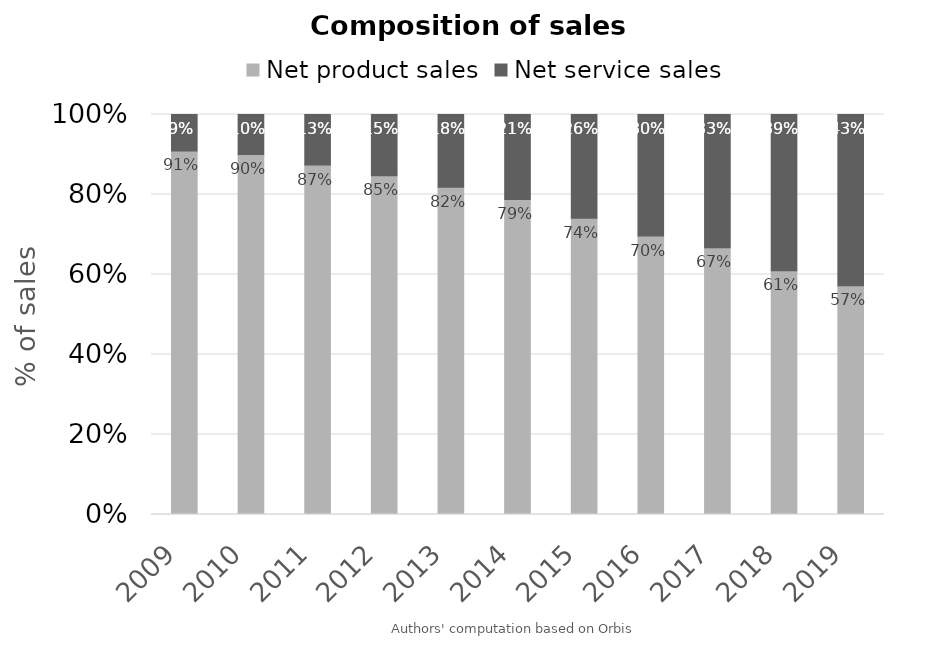
| Category | Net product sales | Net service sales |
|---|---|---|
| 2009.0 | 0.909 | 0.091 |
| 2010.0 | 0.9 | 0.1 |
| 2011.0 | 0.874 | 0.126 |
| 2012.0 | 0.847 | 0.153 |
| 2013.0 | 0.818 | 0.182 |
| 2014.0 | 0.788 | 0.212 |
| 2015.0 | 0.741 | 0.259 |
| 2016.0 | 0.696 | 0.304 |
| 2017.0 | 0.667 | 0.333 |
| 2018.0 | 0.609 | 0.391 |
| 2019.0 | 0.572 | 0.428 |